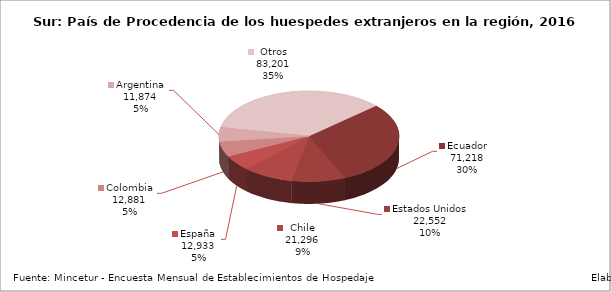
| Category | Series 0 |
|---|---|
| Ecuador | 71218 |
| Estados Unidos | 22552 |
| Chile | 21296 |
| España | 12933 |
| Colombia | 12881 |
| Argentina | 11874 |
| Otros | 83201 |